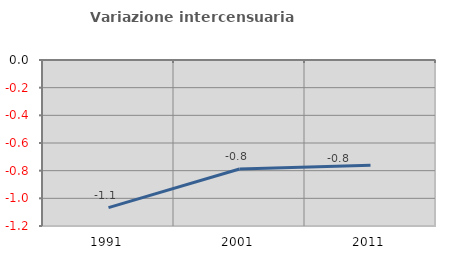
| Category | Variazione intercensuaria annua |
|---|---|
| 1991.0 | -1.067 |
| 2001.0 | -0.788 |
| 2011.0 | -0.761 |